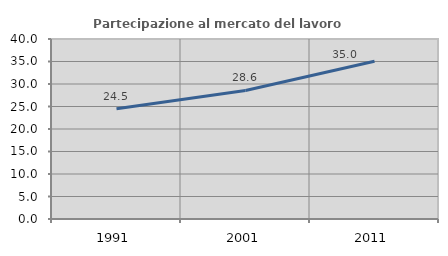
| Category | Partecipazione al mercato del lavoro  femminile |
|---|---|
| 1991.0 | 24.484 |
| 2001.0 | 28.571 |
| 2011.0 | 35.039 |